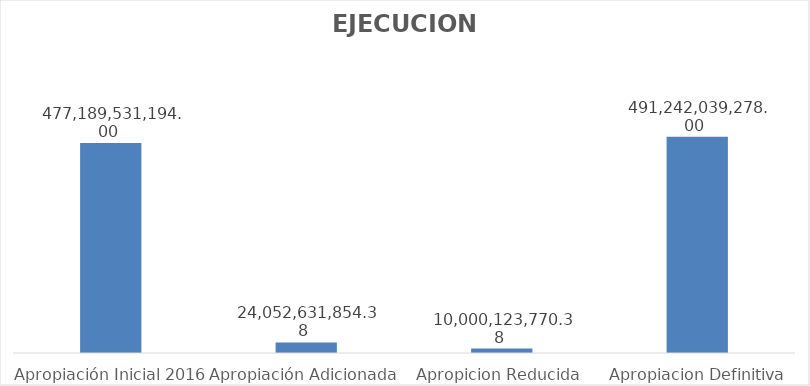
| Category | Series 0 |
|---|---|
| Apropiación Inicial 2016 | 477189531194 |
| Apropiación Adicionada | 24052631854.38 |
| Apropicion Reducida | 10000123770.38 |
| Apropiacion Definitiva 2016 | 491242039278 |